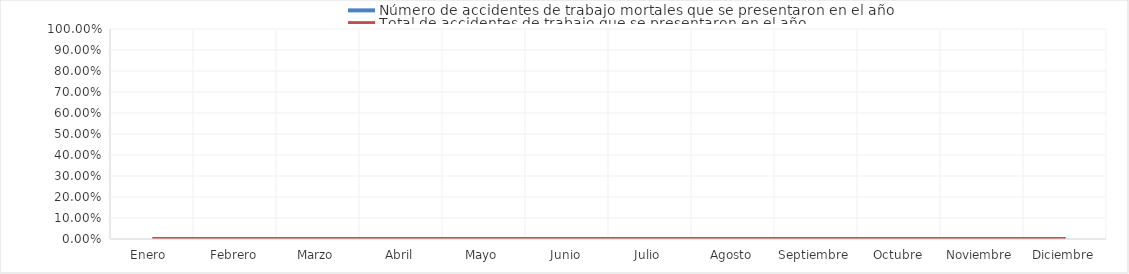
| Category | Número de accidentes de trabajo mortales que se presentaron en el año | Total de accidentes de trabajo que se presentaron en el año |
|---|---|---|
| Enero  | 0 | 0 |
| Febrero | 0 | 0 |
| Marzo | 0 | 0 |
| Abril | 0 | 0 |
| Mayo | 0 | 0 |
| Junio | 0 | 0 |
| Julio | 0 | 0 |
| Agosto | 0 | 0 |
| Septiembre | 0 | 0 |
| Octubre | 0 | 0 |
| Noviembre | 0 | 0 |
| Diciembre | 0 | 0 |